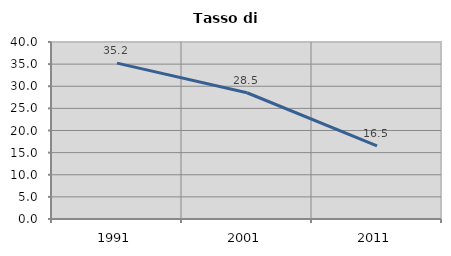
| Category | Tasso di disoccupazione   |
|---|---|
| 1991.0 | 35.231 |
| 2001.0 | 28.531 |
| 2011.0 | 16.508 |